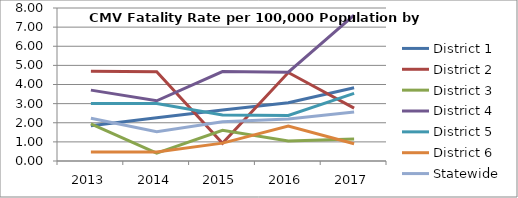
| Category | District 1 | District 2 | District 3 | District 4 | District 5 | District 6 | Statewide |
|---|---|---|---|---|---|---|---|
| 2013.0 | 1.839 | 4.691 | 1.938 | 3.706 | 3.01 | 0.475 | 2.233 |
| 2014.0 | 2.258 | 4.671 | 0.407 | 3.15 | 3.008 | 0.471 | 1.53 |
| 2015.0 | 2.667 | 0.931 | 1.601 | 4.678 | 2.403 | 0.934 | 2.054 |
| 2016.0 | 3.043 | 4.627 | 1.046 | 4.64 | 2.384 | 1.833 | 2.198 |
| 2017.0 | 3.832 | 2.764 | 1.147 | 7.625 | 3.533 | 0.9 | 2.563 |